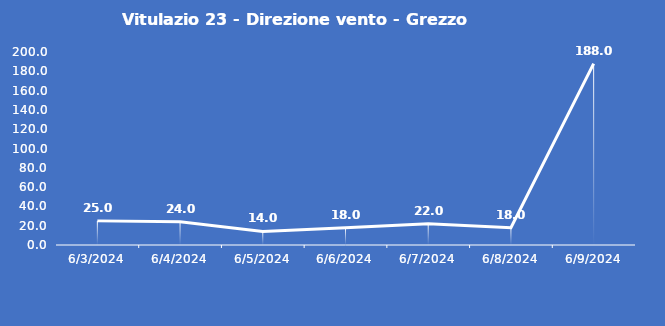
| Category | Vitulazio 23 - Direzione vento - Grezzo (°N) |
|---|---|
| 6/3/24 | 25 |
| 6/4/24 | 24 |
| 6/5/24 | 14 |
| 6/6/24 | 18 |
| 6/7/24 | 22 |
| 6/8/24 | 18 |
| 6/9/24 | 188 |